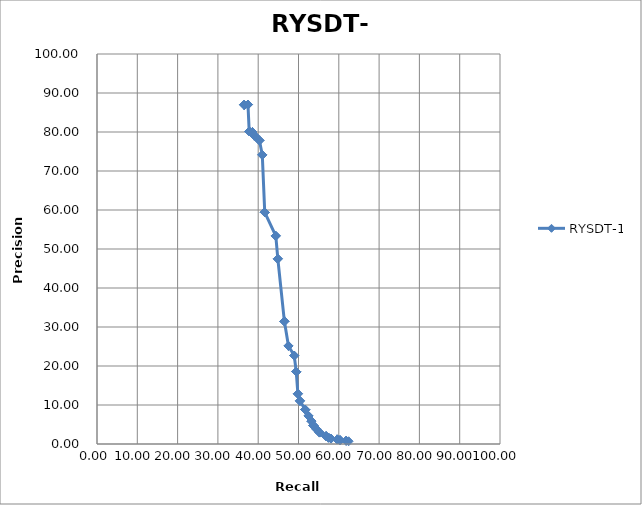
| Category | RYSDT-1 |
|---|---|
| 36.548 | 86.957 |
| 36.548 | 86.957 |
| 36.548 | 86.957 |
| 36.548 | 86.957 |
| 36.548 | 86.957 |
| 36.548 | 86.957 |
| 36.548 | 86.957 |
| 36.548 | 86.957 |
| 36.548 | 86.957 |
| 36.548 | 86.957 |
| 37.462 | 87.028 |
| 37.462 | 87.028 |
| 37.462 | 87.028 |
| 37.462 | 87.028 |
| 37.766 | 80.172 |
| 37.766 | 80.172 |
| 37.766 | 80.172 |
| 38.579 | 80 |
| 38.579 | 80 |
| 38.579 | 80 |
| 39.086 | 79.055 |
| 39.086 | 79.055 |
| 39.086 | 79.055 |
| 39.086 | 79.055 |
| 40.305 | 77.843 |
| 40.305 | 77.843 |
| 40.305 | 77.843 |
| 41.015 | 74.128 |
| 41.015 | 74.128 |
| 41.015 | 74.128 |
| 41.624 | 59.42 |
| 41.624 | 59.42 |
| 41.624 | 59.42 |
| 41.624 | 59.42 |
| 44.365 | 53.358 |
| 44.365 | 53.358 |
| 44.365 | 53.358 |
| 44.873 | 47.476 |
| 44.873 | 47.476 |
| 44.873 | 47.476 |
| 46.497 | 31.456 |
| 46.497 | 31.456 |
| 46.497 | 31.456 |
| 46.497 | 31.456 |
| 47.513 | 25.148 |
| 47.513 | 25.148 |
| 47.513 | 25.148 |
| 48.934 | 22.672 |
| 48.934 | 22.672 |
| 48.934 | 22.672 |
| 49.442 | 18.524 |
| 49.442 | 18.524 |
| 49.442 | 18.524 |
| 49.442 | 18.524 |
| 49.848 | 12.867 |
| 49.848 | 12.867 |
| 49.848 | 12.867 |
| 50.355 | 11.052 |
| 50.355 | 11.052 |
| 50.355 | 11.052 |
| 51.675 | 8.805 |
| 51.675 | 8.805 |
| 51.675 | 8.805 |
| 51.675 | 8.805 |
| 52.487 | 7.199 |
| 52.487 | 7.199 |
| 52.487 | 7.199 |
| 53.198 | 5.867 |
| 53.198 | 5.867 |
| 53.198 | 5.867 |
| 53.706 | 4.747 |
| 53.706 | 4.747 |
| 53.706 | 4.747 |
| 53.706 | 4.747 |
| 54.416 | 3.855 |
| 54.416 | 3.855 |
| 54.416 | 3.855 |
| 55.228 | 2.935 |
| 55.228 | 2.935 |
| 55.228 | 2.935 |
| 56.853 | 2.006 |
| 56.853 | 2.006 |
| 56.853 | 2.006 |
| 56.853 | 2.006 |
| 57.462 | 1.617 |
| 57.462 | 1.617 |
| 57.462 | 1.617 |
| 58.071 | 1.398 |
| 58.071 | 1.398 |
| 58.071 | 1.398 |
| 59.594 | 1.18 |
| 59.594 | 1.18 |
| 59.594 | 1.18 |
| 59.594 | 1.18 |
| 60.305 | 0.987 |
| 60.305 | 0.987 |
| 60.305 | 0.987 |
| 61.827 | 0.838 |
| 61.827 | 0.838 |
| 61.827 | 0.838 |
| 62.437 | 0.704 |